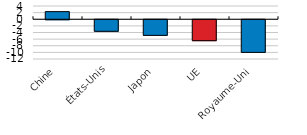
| Category | Change |
|---|---|
| Chine | 2.3 |
| États-Unis | -3.486 |
| Japon | -4.712 |
| UE | -6.322 |
| Royaume-Uni | -9.847 |